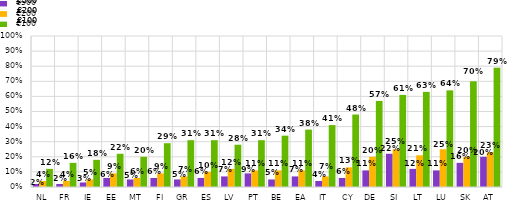
| Category | €500 | €200 | €100 |
|---|---|---|---|
| NL | 0.02 | 0.04 | 0.12 |
| FR | 0.02 | 0.04 | 0.16 |
| IE | 0.03 | 0.05 | 0.18 |
| EE | 0.06 | 0.09 | 0.22 |
| MT | 0.05 | 0.06 | 0.2 |
| FI | 0.06 | 0.09 | 0.29 |
| GR | 0.05 | 0.07 | 0.31 |
| ES | 0.06 | 0.1 | 0.31 |
| LV | 0.07 | 0.12 | 0.28 |
| PT | 0.09 | 0.11 | 0.31 |
| BE | 0.05 | 0.11 | 0.34 |
| EA | 0.07 | 0.11 | 0.38 |
| IT | 0.04 | 0.07 | 0.41 |
| CY | 0.06 | 0.13 | 0.48 |
| DE | 0.11 | 0.2 | 0.57 |
| SI | 0.22 | 0.25 | 0.61 |
| LT | 0.12 | 0.21 | 0.63 |
| LU | 0.11 | 0.25 | 0.64 |
| SK | 0.16 | 0.2 | 0.7 |
| AT | 0.2 | 0.23 | 0.79 |